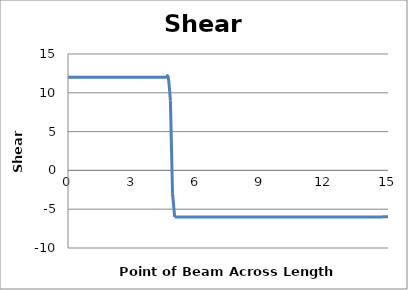
| Category | Shear
(kN) |
|---|---|
| 0.0 | 12 |
| 0.1 | 12 |
| 0.2 | 12 |
| 0.3 | 12 |
| 0.4 | 12 |
| 0.5 | 12 |
| 0.6 | 12 |
| 0.7 | 12 |
| 0.8 | 12 |
| 0.9 | 12 |
| 1.0 | 12 |
| 1.1 | 12 |
| 1.2 | 12 |
| 1.3 | 12 |
| 1.4 | 12 |
| 1.5 | 12 |
| 1.6 | 12 |
| 1.7 | 12 |
| 1.8 | 12 |
| 1.9 | 12 |
| 2.0 | 12 |
| 2.1 | 12 |
| 2.2 | 12 |
| 2.3 | 12 |
| 2.4 | 12 |
| 2.5 | 12 |
| 2.6 | 12 |
| 2.7 | 12 |
| 2.8 | 12 |
| 2.9 | 12 |
| 3.0 | 12 |
| 3.1 | 12 |
| 3.2 | 12 |
| 3.3 | 12 |
| 3.4 | 12 |
| 3.5 | 12 |
| 3.6 | 12 |
| 3.7 | 12 |
| 3.8 | 12 |
| 3.9 | 12 |
| 4.0 | 12 |
| 4.1 | 12 |
| 4.2 | 12 |
| 4.3 | 12 |
| 4.4 | 12 |
| 4.5 | 12 |
| 4.6 | 12 |
| 4.7 | 12 |
| 4.8 | 9 |
| 4.9 | -3 |
| 5.0 | -6 |
| 5.1 | -6 |
| 5.2 | -6 |
| 5.3 | -6 |
| 5.4 | -6 |
| 5.5 | -6 |
| 5.6 | -6 |
| 5.7 | -6 |
| 5.8 | -6 |
| 5.9 | -6 |
| 6.0 | -6 |
| 6.1 | -6 |
| 6.2 | -6 |
| 6.3 | -6 |
| 6.4 | -6 |
| 6.5 | -6 |
| 6.6 | -6 |
| 6.7 | -6 |
| 6.8 | -6 |
| 6.9 | -6 |
| 7.0 | -6 |
| 7.1 | -6 |
| 7.2 | -6 |
| 7.3 | -6 |
| 7.4 | -6 |
| 7.5 | -6 |
| 7.6 | -6 |
| 7.7 | -6 |
| 7.8 | -6 |
| 7.9 | -6 |
| 8.0 | -6 |
| 8.1 | -6 |
| 8.2 | -6 |
| 8.3 | -6 |
| 8.4 | -6 |
| 8.5 | -6 |
| 8.6 | -6 |
| 8.7 | -6 |
| 8.8 | -6 |
| 8.9 | -6 |
| 9.0 | -6 |
| 9.1 | -6 |
| 9.2 | -6 |
| 9.3 | -6 |
| 9.4 | -6 |
| 9.5 | -6 |
| 9.6 | -6 |
| 9.7 | -6 |
| 9.8 | -6 |
| 9.9 | -6 |
| 10.0 | -6 |
| 10.1 | -6 |
| 10.2 | -6 |
| 10.3 | -6 |
| 10.4 | -6 |
| 10.5 | -6 |
| 10.6 | -6 |
| 10.7 | -6 |
| 10.8 | -6 |
| 10.9 | -6 |
| 11.0 | -6 |
| 11.1 | -6 |
| 11.2 | -6 |
| 11.3 | -6 |
| 11.4 | -6 |
| 11.5 | -6 |
| 11.6 | -6 |
| 11.7 | -6 |
| 11.8 | -6 |
| 11.9 | -6 |
| 12.0 | -6 |
| 12.1 | -6 |
| 12.2 | -6 |
| 12.3 | -6 |
| 12.4 | -6 |
| 12.5 | -6 |
| 12.6 | -6 |
| 12.7 | -6 |
| 12.8 | -6 |
| 12.9 | -6 |
| 13.0 | -6 |
| 13.1 | -6 |
| 13.2 | -6 |
| 13.3 | -6 |
| 13.4 | -6 |
| 13.5 | -6 |
| 13.6 | -6 |
| 13.7 | -6 |
| 13.8 | -6 |
| 13.9 | -6 |
| 14.0 | -6 |
| 14.1 | -6 |
| 14.2 | -6 |
| 14.3 | -6 |
| 14.4 | -6 |
| 14.5 | -6 |
| 14.6 | -6 |
| 14.7 | -6 |
| 14.8 | -5.972 |
| 14.9 | -5.972 |
| 15.0 | -5.972 |